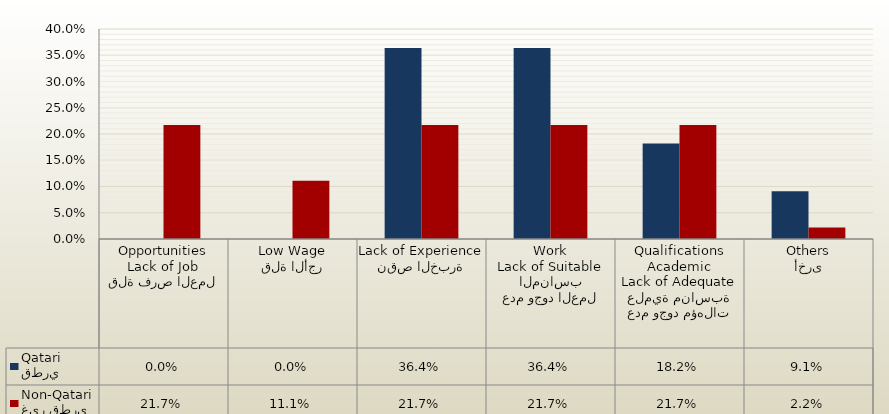
| Category | قطري
Qatari | غير قطري
Non-Qatari |
|---|---|---|
| قلة فرص العمل
Lack of Job Opportunities | 0 | 0.217 |
| قلة الأجر
Low Wage | 0 | 0.111 |
| نقص الخبرة
Lack of Experience | 0.364 | 0.217 |
| عدم وجود العمل المناسب
Lack of Suitable Work | 0.364 | 0.217 |
| عدم وجود مؤهلات علمية مناسبة
Lack of Adequate Academic Qualifications | 0.182 | 0.217 |
| أخرى
Others | 0.091 | 0.022 |